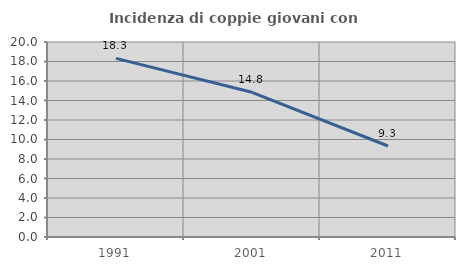
| Category | Incidenza di coppie giovani con figli |
|---|---|
| 1991.0 | 18.325 |
| 2001.0 | 14.844 |
| 2011.0 | 9.335 |